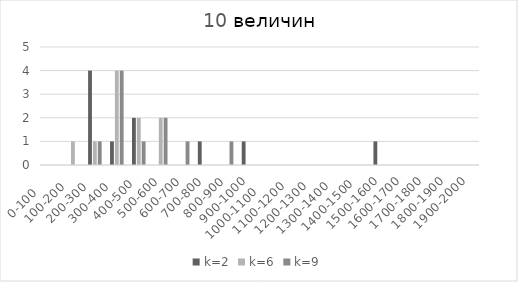
| Category | k=2 | k=6 | k=9 |
|---|---|---|---|
| 0-100     | 0 | 0 | 0 |
| 100-200   | 0 | 1 | 0 |
| 200-300   | 4 | 1 | 1 |
| 300-400   | 1 | 4 | 4 |
| 400-500  | 2 | 2 | 1 |
| 500-600 | 0 | 2 | 2 |
| 600-700 | 0 | 0 | 1 |
| 700-800 | 1 | 0 | 0 |
| 800-900 | 0 | 0 | 1 |
| 900-1000 | 1 | 0 | 0 |
| 1000-1100     | 0 | 0 | 0 |
| 1100-1200   | 0 | 0 | 0 |
| 1200-1300   | 0 | 0 | 0 |
| 1300-1400   | 0 | 0 | 0 |
| 1400-1500  | 0 | 0 | 0 |
| 1500-1600 | 1 | 0 | 0 |
| 1600-1700 | 0 | 0 | 0 |
| 1700-1800 | 0 | 0 | 0 |
| 1800-1900 | 0 | 0 | 0 |
| 1900-2000 | 0 | 0 | 0 |